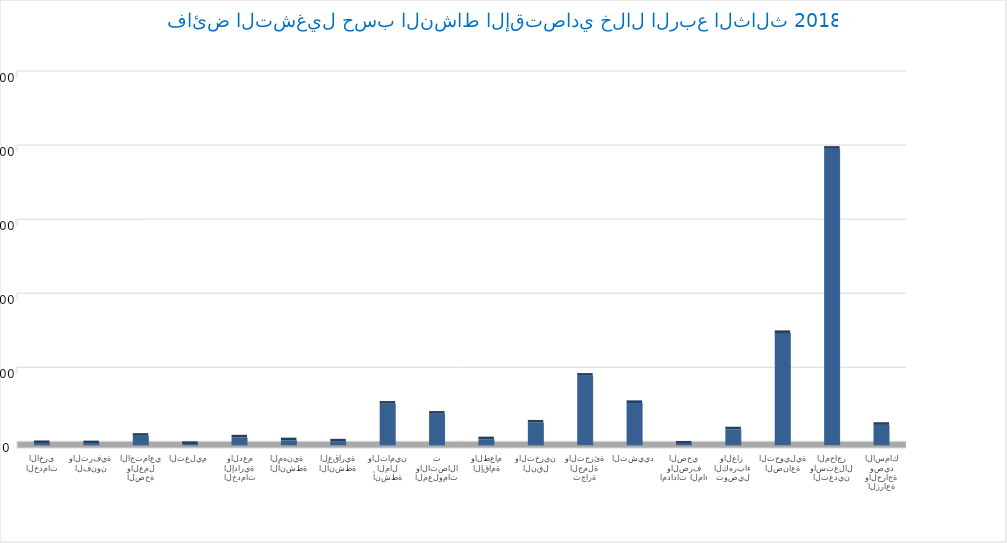
| Category | Series 0 |
|---|---|
| الزراعة والحراجة وصيد الأسماك | 13813827526 |
| التعدين واستغلال المحاجر | 200207622062 |
| الصناعة التحويلية | 75813806189 |
| توصيل الكهرباء والغاز  | 10751080422 |
| امدادات الماء والصرف الصحي | 1104920137 |
| التشييد | 28564308762 |
| تجارة الجملة والتجزئة | 46980940077 |
| النقل والتخزين | 15338280649 |
| الإقامة والطعام | 4065213822 |
| المعلومات والاتصالات | 21333437968 |
| أنشطة المال والتأمين | 28080734960 |
| الأنشطة العقارية | 2597997327 |
| الأنشطة المهنية  | 3375558862 |
| الخدمات الإدارية والدعم | 5305796336 |
| التعليم | 859197712 |
| الصحة والعمل الاجتماعي | 6429603766 |
| الفنون والترفية | 1350577658 |
| الخدمات الأخرى | 1471199301 |